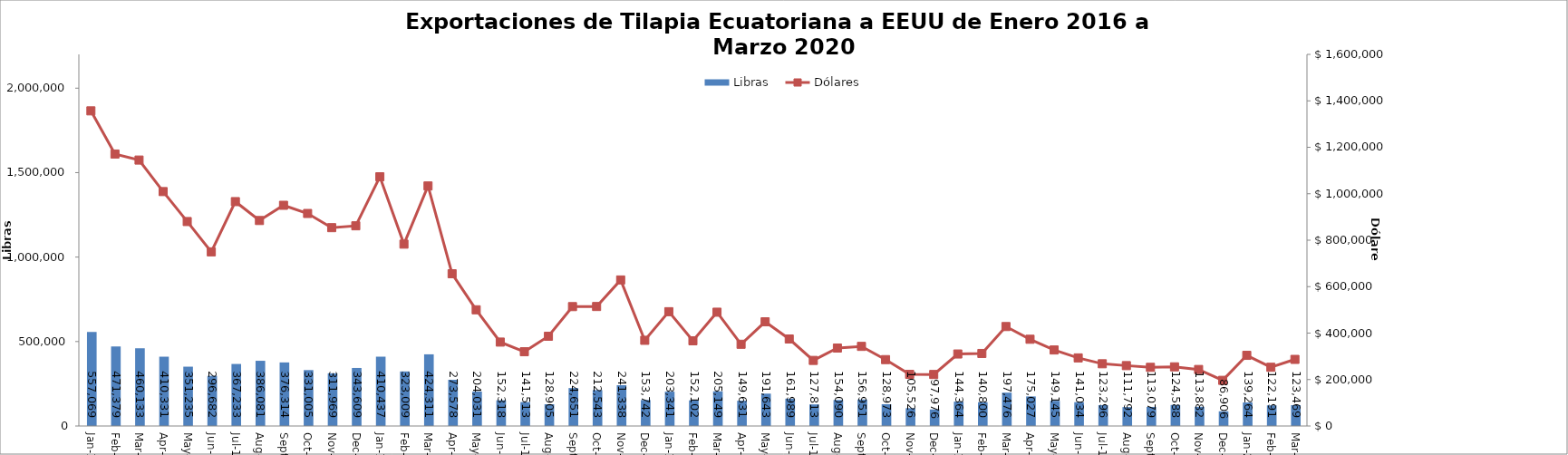
| Category | Libras  |
|---|---|
| 2016-01-01 | 557069.351 |
| 2016-02-01 | 471378.754 |
| 2016-03-01 | 460133.089 |
| 2016-04-01 | 410331.175 |
| 2016-05-01 | 351235 |
| 2016-06-01 | 296682 |
| 2016-07-01 | 367233.45 |
| 2016-08-01 | 386080.575 |
| 2016-09-01 | 376314.197 |
| 2016-10-01 | 331005.258 |
| 2016-11-01 | 311968.537 |
| 2016-12-01 | 343608.956 |
| 2017-01-01 | 410436.996 |
| 2017-02-01 | 323009.174 |
| 2017-03-01 | 424310.544 |
| 2017-04-01 | 273577.632 |
| 2017-05-01 | 204031.321 |
| 2017-06-01 | 152318.019 |
| 2017-07-01 | 141513.274 |
| 2017-08-01 | 128905.167 |
| 2017-09-01 | 224650.945 |
| 2017-10-01 | 212543.281 |
| 2017-11-01 | 241337.562 |
| 2017-12-01 | 153742.19 |
| 2018-01-01 | 203341.281 |
| 2018-02-01 | 152101.968 |
| 2018-03-01 | 205149.053 |
| 2018-04-01 | 149630.611 |
| 2018-05-01 | 191643 |
| 2018-06-01 | 161989 |
| 2018-07-01 | 127813 |
| 2018-08-01 | 154089.894 |
| 2018-09-01 | 156951.494 |
| 2018-10-01 | 128972.628 |
| 2018-11-01 | 105526.466 |
| 2018-12-01 | 97975.634 |
| 2019-01-01 | 144364.157 |
| 2019-02-01 | 140800 |
| 2019-03-01 | 197476 |
| 2019-04-01 | 175027.19 |
| 2019-05-01 | 149144.92 |
| 2019-06-01 | 141034.12 |
| 2019-07-01 | 123295.72 |
| 2019-08-01 | 111792 |
| 2019-09-01 | 113079.347 |
| 2019-10-01 | 124588.429 |
| 2019-11-01 | 113882.151 |
| 2019-12-01 | 86905.72 |
| 2020-01-01 | 139264.124 |
| 2020-02-01 | 122191.168 |
| 2020-03-01 | 123468.964 |